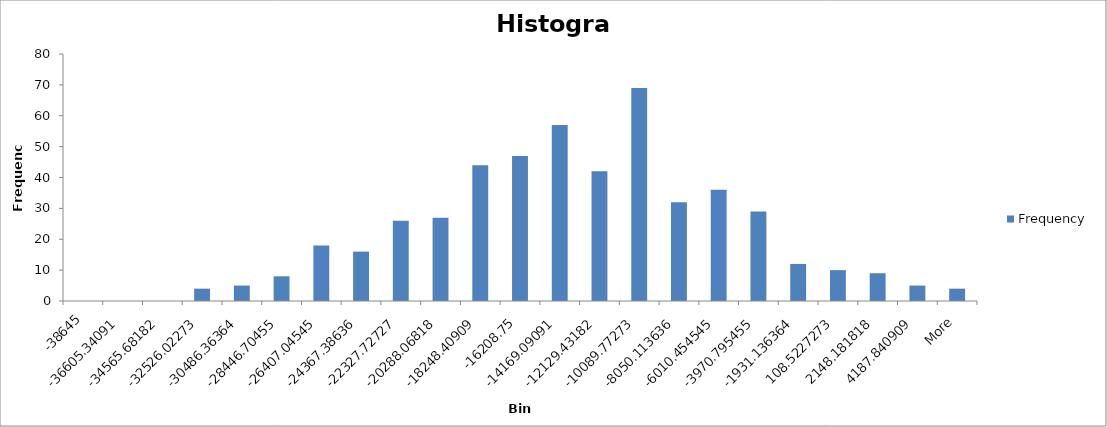
| Category | Frequency |
|---|---|
| -38645 | 0 |
| -36605.34091 | 0 |
| -34565.68182 | 0 |
| -32526.02273 | 4 |
| -30486.36364 | 5 |
| -28446.70455 | 8 |
| -26407.04545 | 18 |
| -24367.38636 | 16 |
| -22327.72727 | 26 |
| -20288.06818 | 27 |
| -18248.40909 | 44 |
| -16208.75 | 47 |
| -14169.09091 | 57 |
| -12129.43182 | 42 |
| -10089.77273 | 69 |
| -8050.113636 | 32 |
| -6010.454545 | 36 |
| -3970.795455 | 29 |
| -1931.136364 | 12 |
| 108.5227273 | 10 |
| 2148.181818 | 9 |
| 4187.840909 | 5 |
| More | 4 |